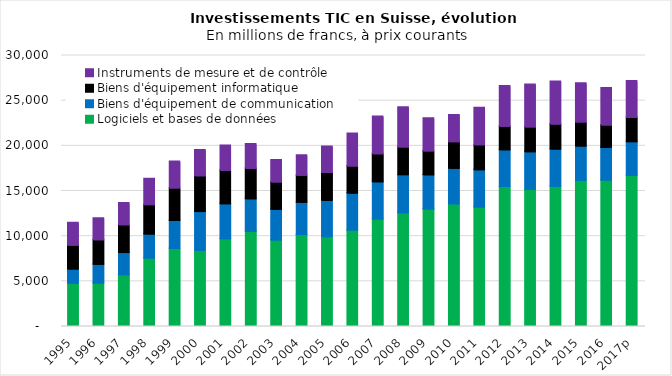
| Category | Logiciels et bases de données | Biens d'équipement de communication | Biens d'équipement informatique  | Instruments de mesure et de contrôle |
|---|---|---|---|---|
| 1995 | 4669.683 | 1586.177 | 2638.715 | 2472.926 |
| 1996 | 4701.253 | 2072.338 | 2713.05 | 2384.095 |
| 1997 | 5619.195 | 2454.237 | 3072.263 | 2413.143 |
| 1998 | 7471.429 | 2658.613 | 3245.486 | 2869.376 |
| 1999 | 8522.717 | 3101.951 | 3603.904 | 2935.638 |
| 2000 | 8323.201 | 4288.079 | 3961.237 | 2852.265 |
| 2001 | 9607.328 | 3865.747 | 3699.586 | 2749.801 |
| 2002 | 10420.987 | 3608.268 | 3364.919 | 2703.968 |
| 2003 | 9471.033 | 3396.94 | 3021.492 | 2432.674 |
| 2004 | 10061.774 | 3572.754 | 2990.672 | 2216.841 |
| 2005 | 9836.945 | 4019.889 | 3079.185 | 2868.127 |
| 2006 | 10577.055 | 4078.842 | 3001.498 | 3609.094 |
| 2007 | 11796.157 | 4106.537 | 3098.338 | 4141.045 |
| 2008 | 12477.708 | 4221.438 | 3069.001 | 4392.255 |
| 2009 | 12902.19 | 3776.615 | 2650.793 | 3616.801 |
| 2010 | 13464.967 | 3942.962 | 2935.433 | 2968.816 |
| 2011 | 13122.693 | 4121.316 | 2761.334 | 4094.486 |
| 2012 | 15380.678 | 4066.475 | 2607.825 | 4450.07 |
| 2013 | 15068.866 | 4167.093 | 2750.773 | 4704.783 |
| 2014 | 15425.608 | 4108.835 | 2762.014 | 4721.652 |
| 2015 | 16084.285 | 3782.591 | 2658.733 | 4288.209 |
| 2016 | 16112.381 | 3599.187 | 2486.357 | 4085.145 |
| 2017p | 16628.101 | 3725.01 | 2676.272 | 4032.81 |